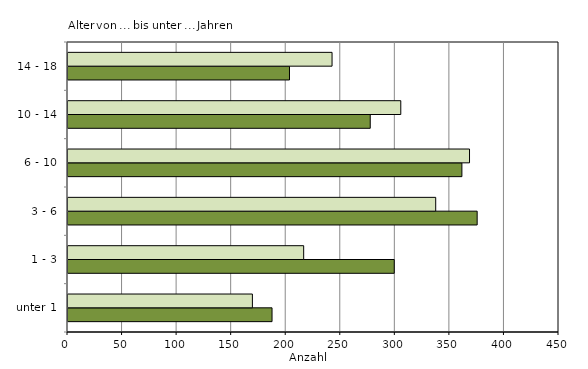
| Category | männlich | weiblich |
|---|---|---|
| unter 1 | 187 | 169 |
| 1 - 3 | 299 | 216 |
| 3 - 6 | 375 | 337 |
| 6 - 10 | 361 | 368 |
| 10 - 14 | 277 | 305 |
| 14 - 18 | 203 | 242 |